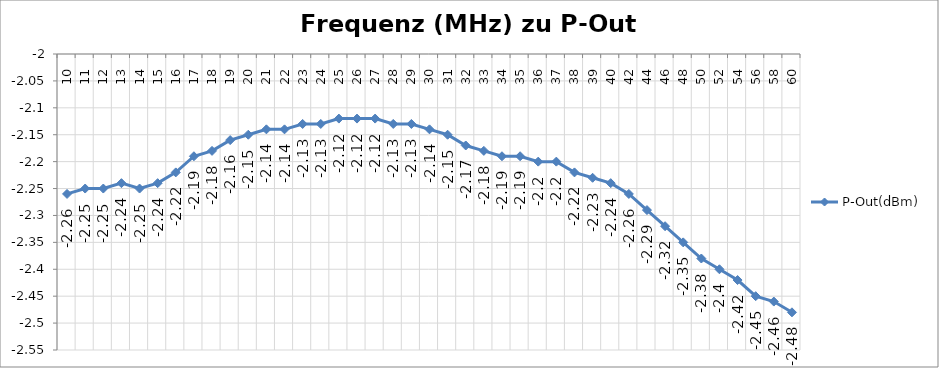
| Category | P-Out(dBm) |
|---|---|
| 10.0 | -2.26 |
| 11.0 | -2.25 |
| 12.0 | -2.25 |
| 13.0 | -2.24 |
| 14.0 | -2.25 |
| 15.0 | -2.24 |
| 16.0 | -2.22 |
| 17.0 | -2.19 |
| 18.0 | -2.18 |
| 19.0 | -2.16 |
| 20.0 | -2.15 |
| 21.0 | -2.14 |
| 22.0 | -2.14 |
| 23.0 | -2.13 |
| 24.0 | -2.13 |
| 25.0 | -2.12 |
| 26.0 | -2.12 |
| 27.0 | -2.12 |
| 28.0 | -2.13 |
| 29.0 | -2.13 |
| 30.0 | -2.14 |
| 31.0 | -2.15 |
| 32.0 | -2.17 |
| 33.0 | -2.18 |
| 34.0 | -2.19 |
| 35.0 | -2.19 |
| 36.0 | -2.2 |
| 37.0 | -2.2 |
| 38.0 | -2.22 |
| 39.0 | -2.23 |
| 40.0 | -2.24 |
| 42.0 | -2.26 |
| 44.0 | -2.29 |
| 46.0 | -2.32 |
| 48.0 | -2.35 |
| 50.0 | -2.38 |
| 52.0 | -2.4 |
| 54.0 | -2.42 |
| 56.0 | -2.45 |
| 58.0 | -2.46 |
| 60.0 | -2.48 |